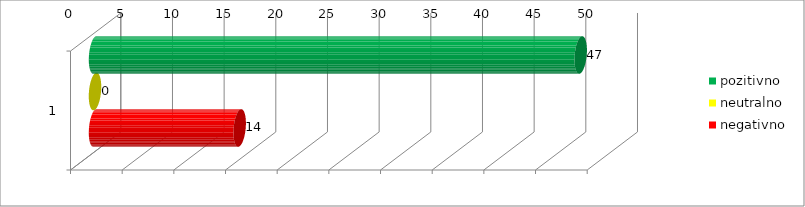
| Category | pozitivno | neutralno | negativno |
|---|---|---|---|
| 0 | 47 | 0 | 14 |